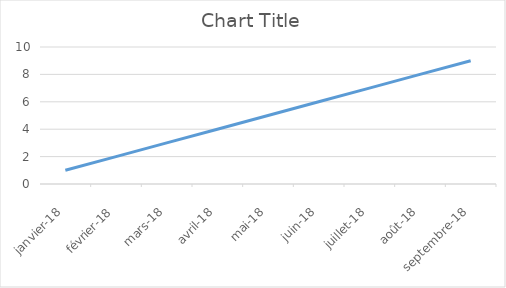
| Category | Series 0 |
|---|---|
| 2018-01-22 | 1 |
| 2018-02-22 | 2 |
| 2018-03-22 | 3 |
| 2018-04-22 | 4 |
| 2018-05-22 | 5 |
| 2018-06-22 | 6 |
| 2018-07-22 | 7 |
| 2018-08-22 | 8 |
| 2018-09-22 | 9 |